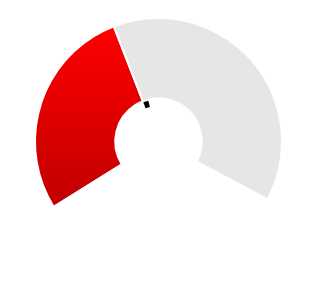
| Category | Series 1 |
|---|---|
| 0 | 0.42 |
| 1 | 0.03 |
| 2 | 1.05 |